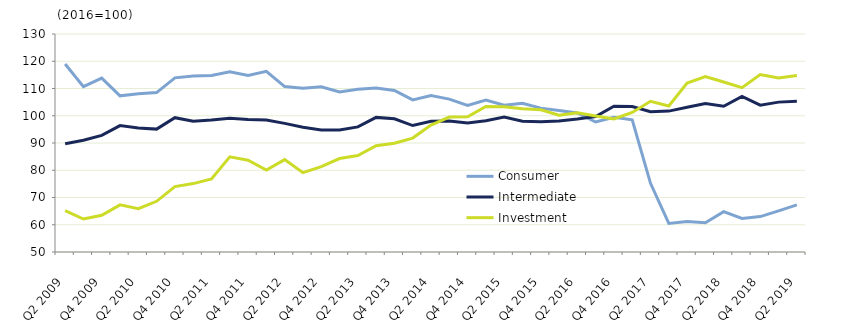
| Category | Consumer | Intermediate | Investment |
|---|---|---|---|
| Q2 2009 | 119 | 89.7 | 65.2 |
|  | 110.7 | 91 | 62.1 |
| Q4 2009 | 113.8 | 92.8 | 63.5 |
|  | 107.3 | 96.4 | 67.3 |
| Q2 2010 | 108.1 | 95.5 | 65.9 |
|  | 108.5 | 95.1 | 68.6 |
| Q4 2010 | 113.9 | 99.3 | 74 |
|  | 114.6 | 98 | 75.1 |
| Q2 2011 | 114.8 | 98.4 | 76.8 |
|  | 116.1 | 99.1 | 84.9 |
| Q4 2011 | 114.8 | 98.6 | 83.7 |
|  | 116.3 | 98.4 | 80.1 |
| Q2 2012 | 110.7 | 97.2 | 83.9 |
|  | 110.1 | 95.8 | 79.1 |
| Q4 2012 | 110.6 | 94.8 | 81.3 |
|  | 108.7 | 94.8 | 84.3 |
| Q2 2013 | 109.7 | 95.9 | 85.4 |
|  | 110.2 | 99.4 | 89 |
| Q4 2013 | 109.3 | 98.9 | 89.9 |
|  | 105.8 | 96.4 | 91.8 |
| Q2 2014 | 107.4 | 98 | 96.6 |
|  | 106.1 | 98.1 | 99.5 |
| Q4 2014 | 103.8 | 97.3 | 99.6 |
|  | 105.8 | 98.2 | 103.4 |
| Q2 2015 | 103.9 | 99.5 | 103.3 |
|  | 104.6 | 98 | 102.6 |
| Q4 2015 | 102.8 | 97.8 | 102.2 |
|  | 101.9 | 98.1 | 100.2 |
| Q2 2016 | 101 | 98.8 | 101.1 |
|  | 97.7 | 99.7 | 99.9 |
| Q4 2016 | 99.4 | 103.5 | 98.8 |
|  | 98.5 | 103.4 | 101.2 |
| Q2 2017 | 75.2 | 101.5 | 105.3 |
|  | 60.5 | 101.7 | 103.6 |
| Q4 2017 | 61.2 | 103.1 | 112 |
|  | 60.7 | 104.5 | 114.4 |
| Q2 2018 | 64.8 | 103.5 | 112.4 |
|  | 62.3 | 107.1 | 110.3 |
| Q4 2018 | 63 | 103.9 | 115.1 |
|  | 65.1 | 105 | 113.9 |
| Q2 2019 | 67.3 | 105.3 | 114.8 |